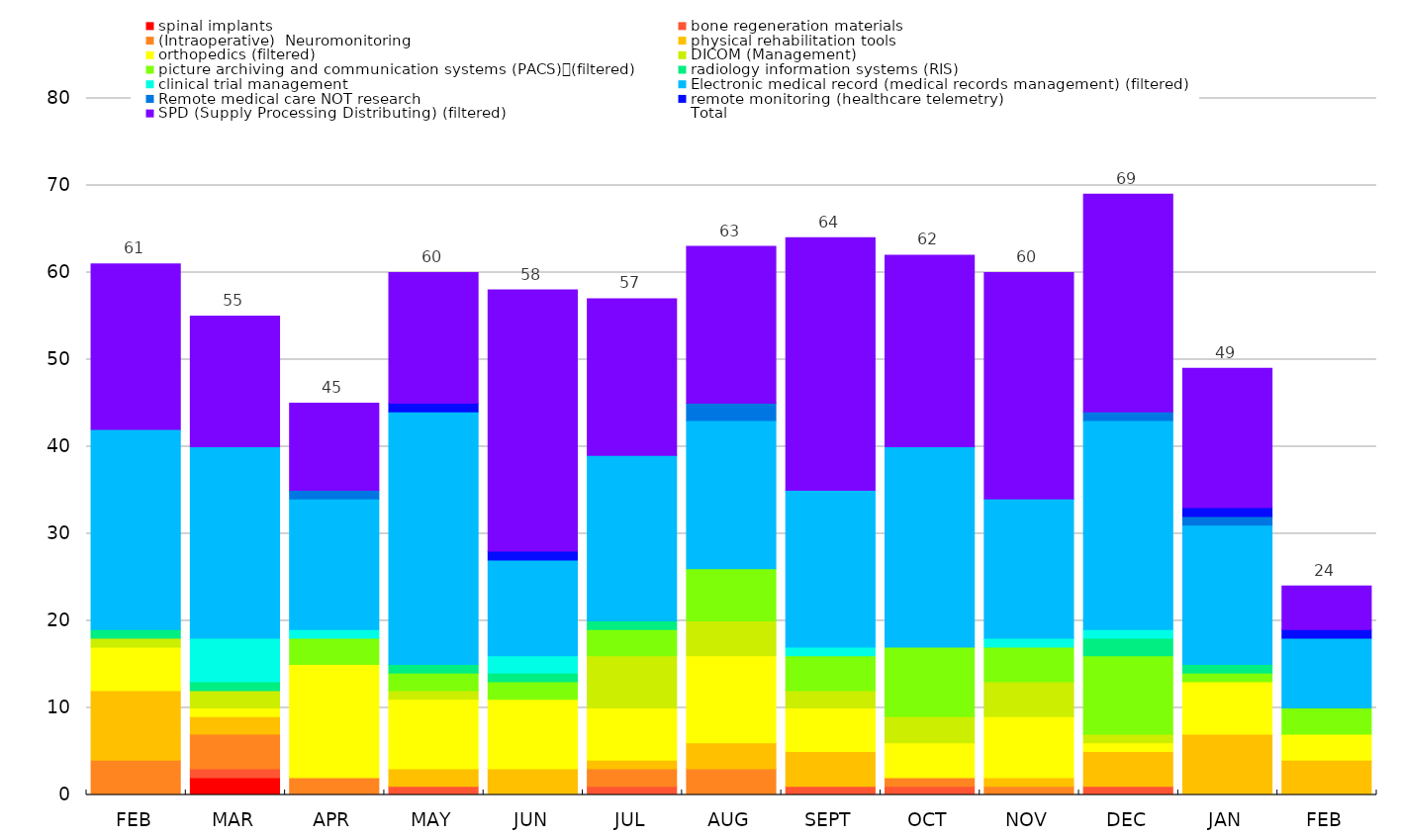
| Category | spinal implants | bone regeneration materials | (Intraoperative)  Neuromonitoring | physical rehabilitation tools | orthopedics (filtered) | DICOM (Management) | picture archiving and communication systems (PACS)　(filtered) | radiology information systems (RIS) | clinical trial management | Electronic medical record (medical records management) (filtered) | Remote medical care NOT research | remote monitoring (healthcare telemetry) | SPD (Supply Processing Distributing) (filtered) |
|---|---|---|---|---|---|---|---|---|---|---|---|---|---|
| FEB | 0 | 0 | 4 | 8 | 5 | 1 | 0 | 1 | 0 | 23 | 0 | 0 | 19 |
| MAR | 2 | 1 | 4 | 2 | 1 | 2 | 0 | 1 | 5 | 22 | 0 | 0 | 15 |
| APR | 0 | 0 | 2 | 0 | 13 | 0 | 3 | 0 | 1 | 15 | 1 | 0 | 10 |
| MAY | 0 | 1 | 0 | 2 | 8 | 1 | 2 | 1 | 0 | 29 | 0 | 1 | 15 |
| JUN | 0 | 0 | 0 | 3 | 8 | 0 | 2 | 1 | 2 | 11 | 0 | 1 | 30 |
| JUL | 0 | 1 | 2 | 1 | 6 | 6 | 3 | 1 | 0 | 19 | 0 | 0 | 18 |
| AUG | 0 | 0 | 3 | 3 | 10 | 4 | 6 | 0 | 0 | 17 | 2 | 0 | 18 |
| SEPT | 0 | 1 | 0 | 4 | 5 | 2 | 4 | 0 | 1 | 18 | 0 | 0 | 29 |
| OCT | 0 | 1 | 1 | 0 | 4 | 3 | 8 | 0 | 0 | 23 | 0 | 0 | 22 |
| NOV | 0 | 0 | 1 | 1 | 7 | 4 | 4 | 0 | 1 | 16 | 0 | 0 | 26 |
| DEC | 0 | 1 | 0 | 4 | 1 | 1 | 9 | 2 | 1 | 24 | 1 | 0 | 25 |
| JAN | 0 | 0 | 0 | 7 | 6 | 0 | 1 | 1 | 0 | 16 | 1 | 1 | 16 |
| FEB | 0 | 0 | 0 | 4 | 3 | 0 | 3 | 0 | 0 | 8 | 0 | 1 | 5 |